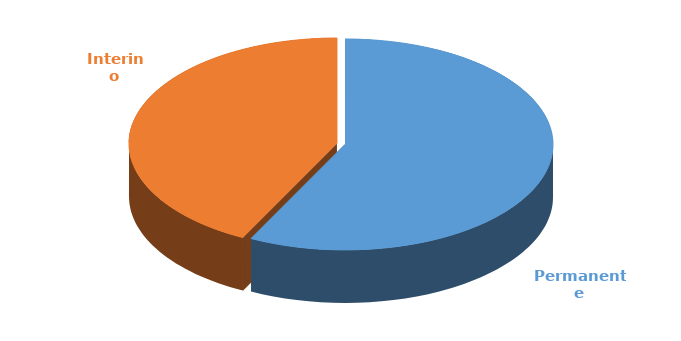
| Category | Cantidad |
|---|---|
| Permanente | 3261 |
| Interino | 2414 |